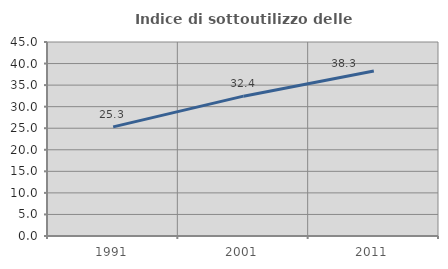
| Category | Indice di sottoutilizzo delle abitazioni  |
|---|---|
| 1991.0 | 25.303 |
| 2001.0 | 32.439 |
| 2011.0 | 38.282 |